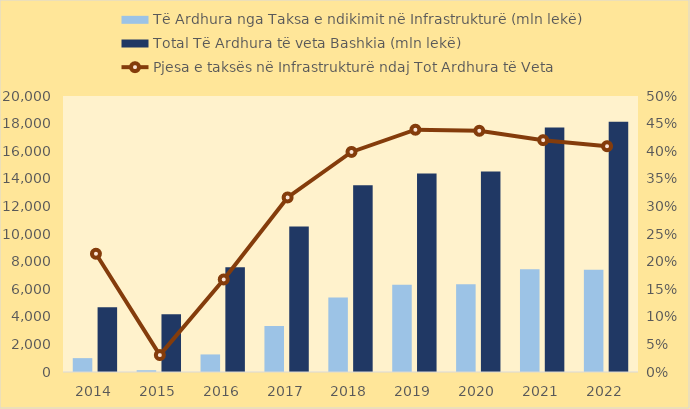
| Category | Të Ardhura nga Taksa e ndikimit në Infrastrukturë (mln lekë) | Total Të Ardhura të veta Bashkia (mln lekë) |
|---|---|---|
| 2014.0 | 1004.843 | 4690.815 |
| 2015.0 | 128.325 | 4182.1 |
| 2016.0 | 1272.832 | 7592.36 |
| 2017.0 | 3334.883 | 10547.112 |
| 2018.0 | 5398.329 | 13540.111 |
| 2019.0 | 6315.307 | 14388.627 |
| 2020.0 | 6350.959 | 14534.42 |
| 2021.0 | 7438.142 | 17709.203 |
| 2022.0 | 7414.036 | 18126.268 |